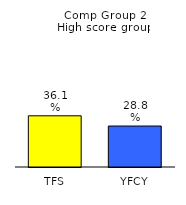
| Category | Series 0 |
|---|---|
| TFS | 0.361 |
| YFCY | 0.288 |